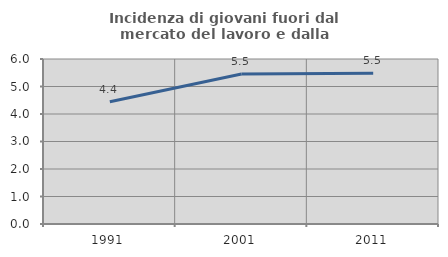
| Category | Incidenza di giovani fuori dal mercato del lavoro e dalla formazione  |
|---|---|
| 1991.0 | 4.444 |
| 2001.0 | 5.455 |
| 2011.0 | 5.479 |